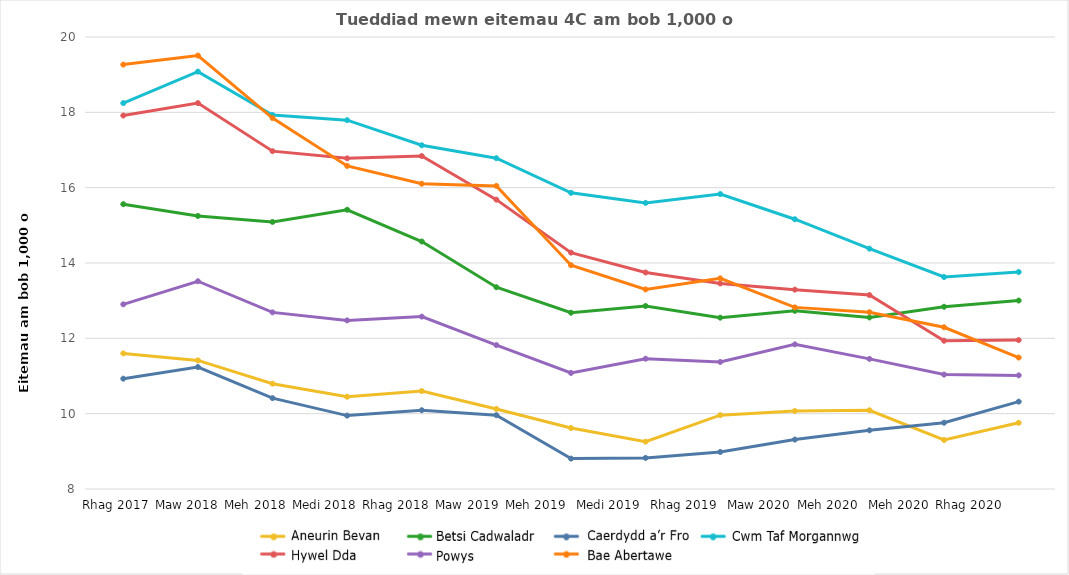
| Category | Aneurin Bevan | Betsi Cadwaladr | Cardiff And Vale | Cwm Taf Morgannwg | Hywel Dda | Powys | Swansea Bay |
|---|---|---|---|---|---|---|---|
| Dec 2017 | 11.6 | 15.562 | 10.929 | 18.246 | 17.915 | 12.902 | 19.268 |
| Mar 2018 | 11.414 | 15.249 | 11.238 | 19.08 | 18.245 | 13.516 | 19.507 |
| Jun 2018 | 10.796 | 15.091 | 10.411 | 17.929 | 16.969 | 12.689 | 17.847 |
| Sep 2018 | 10.45 | 15.414 | 9.949 | 17.792 | 16.778 | 12.476 | 16.577 |
| Dec 2018 | 10.601 | 14.571 | 10.091 | 17.125 | 16.839 | 12.577 | 16.104 |
| Mar 2019 | 10.126 | 13.357 | 9.959 | 16.782 | 15.682 | 11.821 | 16.047 |
| Jun 2019 | 9.619 | 12.68 | 8.807 | 15.862 | 14.276 | 11.082 | 13.942 |
| Sep 2019 | 9.257 | 12.858 | 8.825 | 15.596 | 13.748 | 11.46 | 13.298 |
| Dec 2019 | 9.961 | 12.549 | 8.984 | 15.83 | 13.457 | 11.373 | 13.592 |
| Mar 2020 | 10.07 | 12.731 | 9.312 | 15.162 | 13.293 | 11.839 | 12.822 |
| Jun 2020 | 10.09 | 12.554 | 9.558 | 14.381 | 13.148 | 11.454 | 12.694 |
| Sep 2020 | 9.302 | 12.838 | 9.76 | 13.628 | 11.936 | 11.038 | 12.295 |
| Dec 2020 | 9.758 | 13.004 | 10.32 | 13.761 | 11.953 | 11.017 | 11.49 |